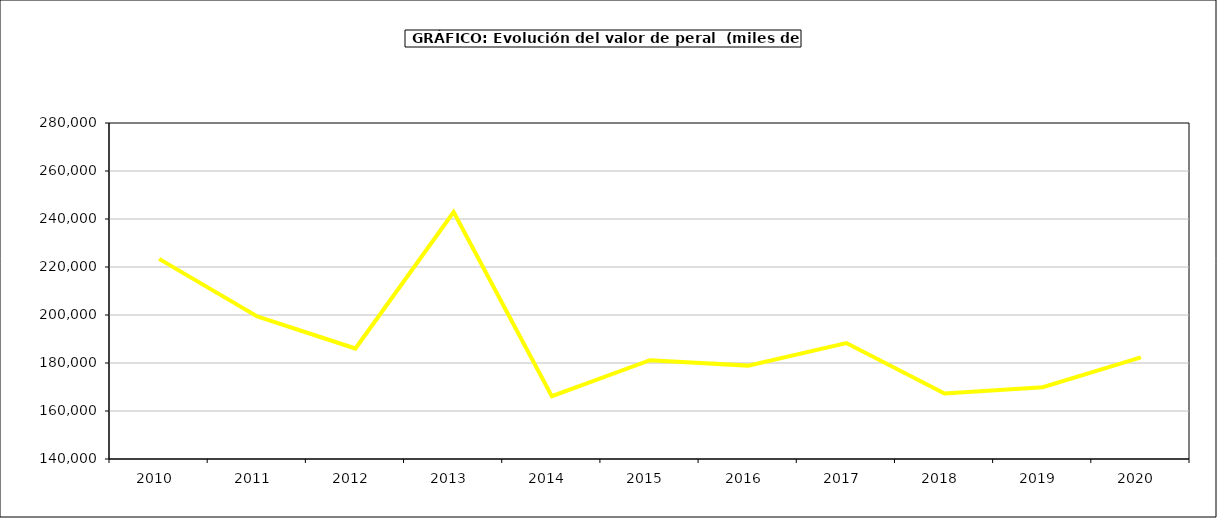
| Category | valor peral |
|---|---|
| 2010.0 | 223375.858 |
| 2011.0 | 199365.811 |
| 2012.0 | 186031.625 |
| 2013.0 | 242867.092 |
| 2014.0 | 166145.606 |
| 2015.0 | 181166 |
| 2016.0 | 178909 |
| 2017.0 | 188326.979 |
| 2018.0 | 167289.385 |
| 2019.0 | 169898.246 |
| 2020.0 | 182329.972 |